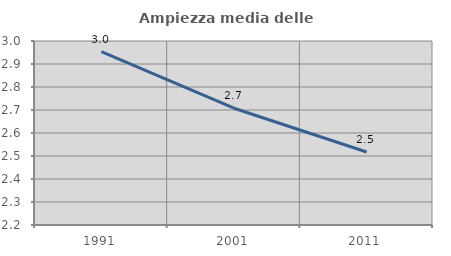
| Category | Ampiezza media delle famiglie |
|---|---|
| 1991.0 | 2.954 |
| 2001.0 | 2.708 |
| 2011.0 | 2.517 |